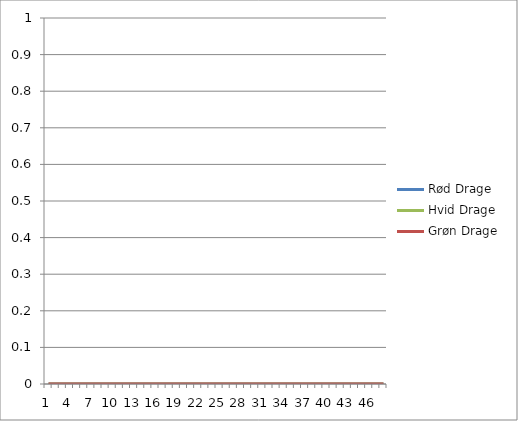
| Category | Rød Drage | Hvid Drage | Grøn Drage |
|---|---|---|---|
| 0 | 0 | 0 | 0 |
| 1 | 0 | 0 | 0 |
| 2 | 0 | 0 | 0 |
| 3 | 0 | 0 | 0 |
| 4 | 0 | 0 | 0 |
| 5 | 0 | 0 | 0 |
| 6 | 0 | 0 | 0 |
| 7 | 0 | 0 | 0 |
| 8 | 0 | 0 | 0 |
| 9 | 0 | 0 | 0 |
| 10 | 0 | 0 | 0 |
| 11 | 0 | 0 | 0 |
| 12 | 0 | 0 | 0 |
| 13 | 0 | 0 | 0 |
| 14 | 0 | 0 | 0 |
| 15 | 0 | 0 | 0 |
| 16 | 0 | 0 | 0 |
| 17 | 0 | 0 | 0 |
| 18 | 0 | 0 | 0 |
| 19 | 0 | 0 | 0 |
| 20 | 0 | 0 | 0 |
| 21 | 0 | 0 | 0 |
| 22 | 0 | 0 | 0 |
| 23 | 0 | 0 | 0 |
| 24 | 0 | 0 | 0 |
| 25 | 0 | 0 | 0 |
| 26 | 0 | 0 | 0 |
| 27 | 0 | 0 | 0 |
| 28 | 0 | 0 | 0 |
| 29 | 0 | 0 | 0 |
| 30 | 0 | 0 | 0 |
| 31 | 0 | 0 | 0 |
| 32 | 0 | 0 | 0 |
| 33 | 0 | 0 | 0 |
| 34 | 0 | 0 | 0 |
| 35 | 0 | 0 | 0 |
| 36 | 0 | 0 | 0 |
| 37 | 0 | 0 | 0 |
| 38 | 0 | 0 | 0 |
| 39 | 0 | 0 | 0 |
| 40 | 0 | 0 | 0 |
| 41 | 0 | 0 | 0 |
| 42 | 0 | 0 | 0 |
| 43 | 0 | 0 | 0 |
| 44 | 0 | 0 | 0 |
| 45 | 0 | 0 | 0 |
| 46 | 0 | 0 | 0 |
| 47 | 0 | 0 | 0 |